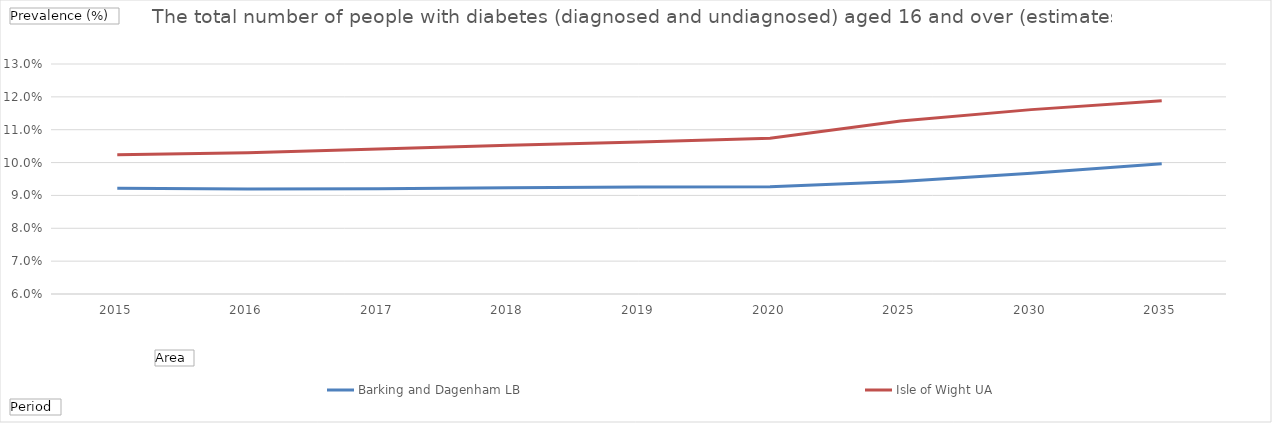
| Category | Barking and Dagenham LB | Isle of Wight UA |
|---|---|---|
| 2015 | 0.092 | 0.102 |
| 2016 | 0.092 | 0.103 |
| 2017 | 0.092 | 0.104 |
| 2018 | 0.092 | 0.105 |
| 2019 | 0.093 | 0.106 |
| 2020 | 0.093 | 0.107 |
| 2025 | 0.094 | 0.113 |
| 2030 | 0.097 | 0.116 |
| 2035 | 0.1 | 0.119 |